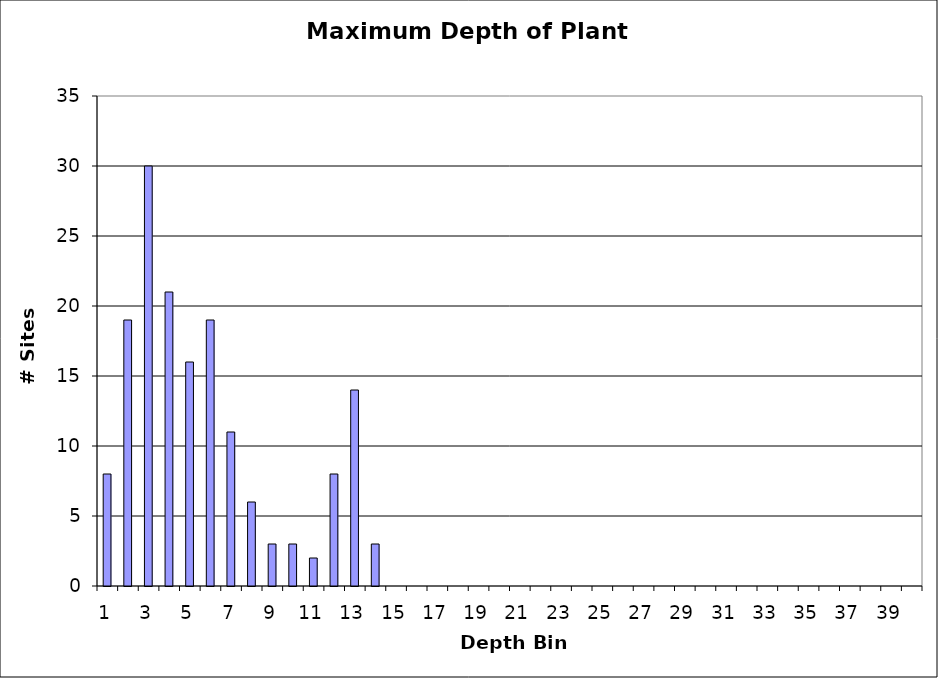
| Category | Series 0 |
|---|---|
| 1.0 | 8 |
| 2.0 | 19 |
| 3.0 | 30 |
| 4.0 | 21 |
| 5.0 | 16 |
| 6.0 | 19 |
| 7.0 | 11 |
| 8.0 | 6 |
| 9.0 | 3 |
| 10.0 | 3 |
| 11.0 | 2 |
| 12.0 | 8 |
| 13.0 | 14 |
| 14.0 | 3 |
| 15.0 | 0 |
| 16.0 | 0 |
| 17.0 | 0 |
| 18.0 | 0 |
| 19.0 | 0 |
| 20.0 | 0 |
| 21.0 | 0 |
| 22.0 | 0 |
| 23.0 | 0 |
| 24.0 | 0 |
| 25.0 | 0 |
| 26.0 | 0 |
| 27.0 | 0 |
| 28.0 | 0 |
| 29.0 | 0 |
| 30.0 | 0 |
| 31.0 | 0 |
| 32.0 | 0 |
| 33.0 | 0 |
| 34.0 | 0 |
| 35.0 | 0 |
| 36.0 | 0 |
| 37.0 | 0 |
| 38.0 | 0 |
| 39.0 | 0 |
| 40.0 | 0 |